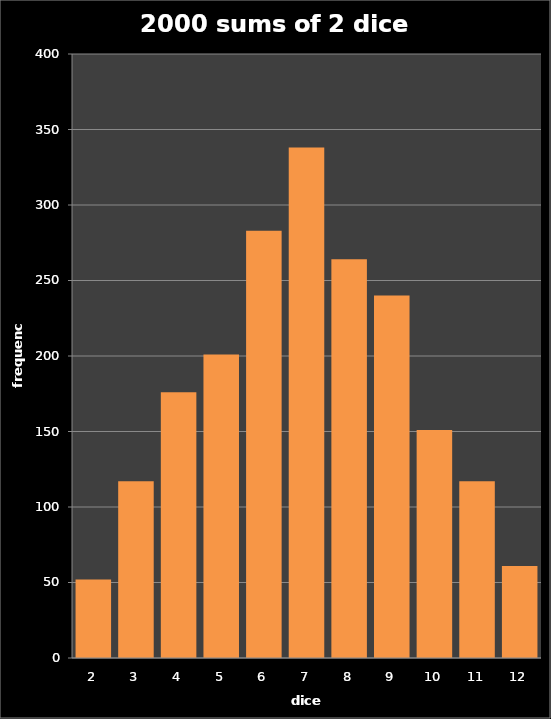
| Category | freq1 |
|---|---|
| 2.0 | 52 |
| 3.0 | 117 |
| 4.0 | 176 |
| 5.0 | 201 |
| 6.0 | 283 |
| 7.0 | 338 |
| 8.0 | 264 |
| 9.0 | 240 |
| 10.0 | 151 |
| 11.0 | 117 |
| 12.0 | 61 |